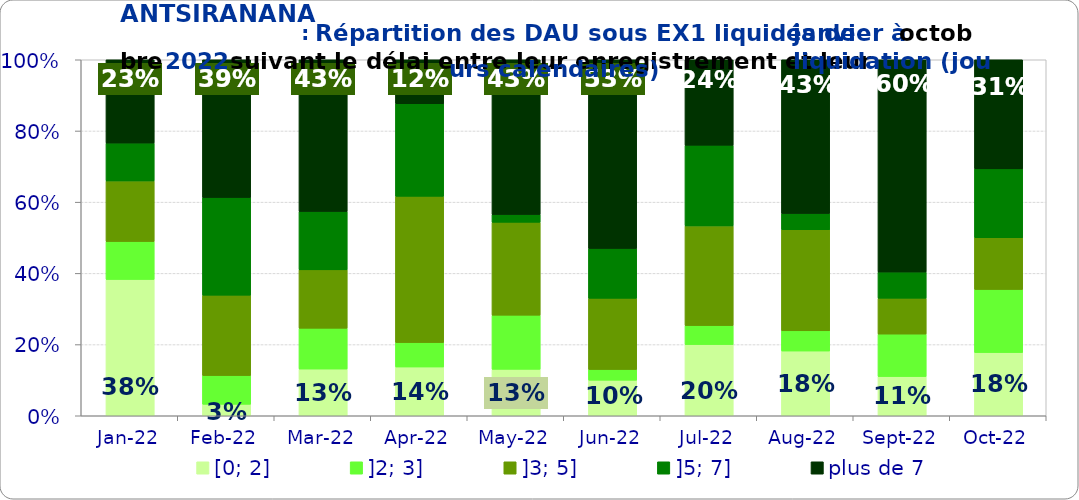
| Category | [0; 2] | ]2; 3] | ]3; 5] | ]5; 7] | plus de 7 |
|---|---|---|---|---|---|
| 2022-01-01 | 0.383 | 0.106 | 0.17 | 0.106 | 0.234 |
| 2022-02-01 | 0.032 | 0.081 | 0.226 | 0.274 | 0.387 |
| 2022-03-01 | 0.131 | 0.115 | 0.164 | 0.164 | 0.426 |
| 2022-04-01 | 0.137 | 0.068 | 0.411 | 0.26 | 0.123 |
| 2022-05-01 | 0.13 | 0.152 | 0.261 | 0.022 | 0.435 |
| 2022-06-01 | 0.1 | 0.03 | 0.2 | 0.14 | 0.53 |
| 2022-07-01 | 0.2 | 0.053 | 0.28 | 0.227 | 0.24 |
| 2022-08-01 | 0.182 | 0.057 | 0.284 | 0.045 | 0.432 |
| 2022-09-01 | 0.11 | 0.119 | 0.101 | 0.073 | 0.596 |
| 2022-10-01 | 0.177 | 0.177 | 0.145 | 0.194 | 0.306 |